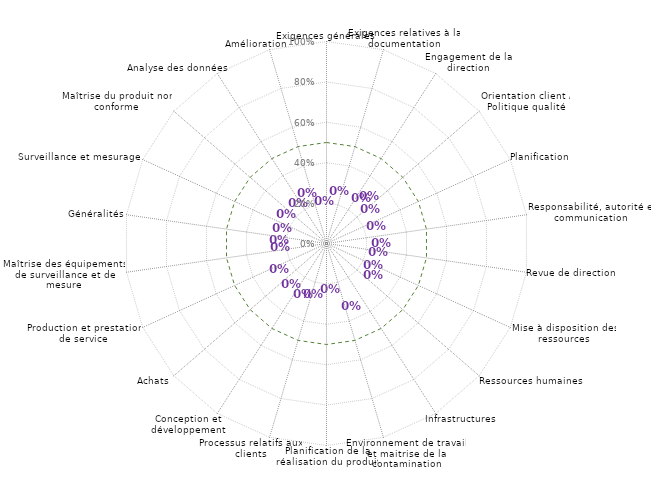
| Category | conforme | Résultats |
|---|---|---|
| 0 | 0.5 | 0 |
| 1 | 0.5 | 0 |
| 2 | 0.5 | 0 |
| 3 | 0.5 | 0 |
| 4 | 0.5 | 0 |
| 5 | 0.5 | 0 |
| 6 | 0.5 | 0 |
| 7 | 0.5 | 0 |
| 8 | 0.5 | 0 |
| 9 | 0.5 | 0 |
| 10 | 0.5 | 0 |
| 11 | 0.5 | 0 |
| 12 | 0.5 | 0 |
| 13 | 0.5 | 0 |
| 14 | 0.5 | 0 |
| 15 | 0.5 | 0 |
| 16 | 0.5 | 0 |
| 17 | 0.5 | 0 |
| 18 | 0.5 | 0 |
| 19 | 0.5 | 0 |
| 20 | 0.5 | 0 |
| 21 | 0.5 | 0 |